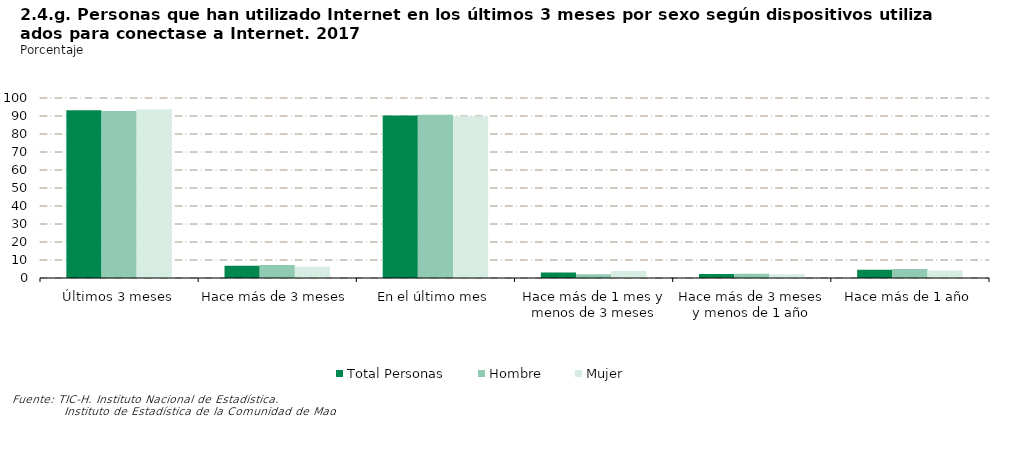
| Category | Total Personas | Hombre | Mujer |
|---|---|---|---|
| Últimos 3 meses | 93.263 | 92.726 | 93.79 |
| Hace más de 3 meses | 6.737 | 7.274 | 6.21 |
| En el último mes | 90.276 | 90.7 | 89.86 |
| Hace más de 1 mes y menos de 3 meses | 2.987 | 2.027 | 3.93 |
| Hace más de 3 meses y menos de 1 año | 2.205 | 2.339 | 2.073 |
| Hace más de 1 año | 4.532 | 4.934 | 4.137 |